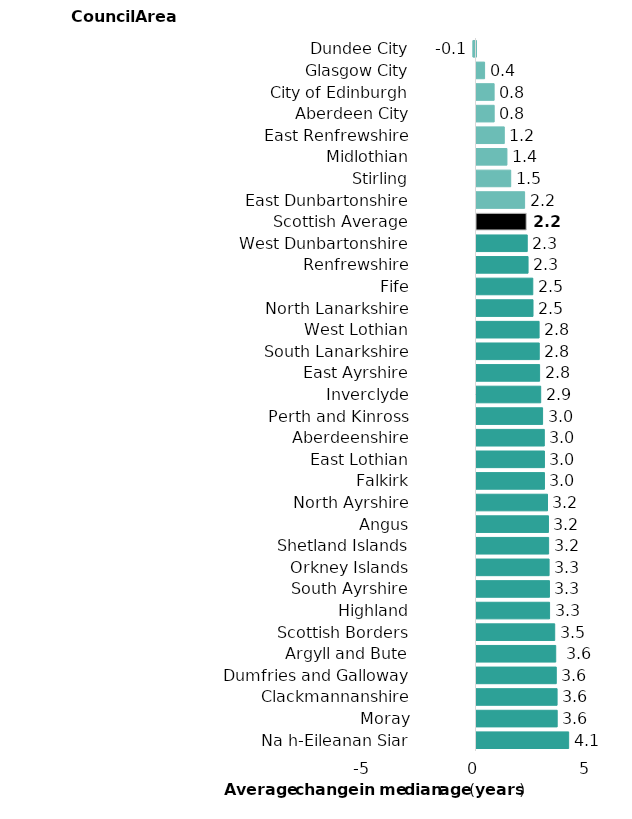
| Category | Series 0 |
|---|---|
| Na h-Eileanan Siar | 4.133 |
| Moray | 3.618 |
| Clackmannanshire | 3.614 |
| Dumfries and Galloway | 3.578 |
| Argyll and Bute | 3.553 |
| Scottish Borders | 3.507 |
| Highland | 3.277 |
| South Ayrshire | 3.271 |
| Orkney Islands | 3.256 |
| Shetland Islands | 3.235 |
| Angus | 3.226 |
| North Ayrshire | 3.184 |
| Falkirk | 3.047 |
| East Lothian | 3.046 |
| Aberdeenshire | 3.041 |
| Perth and Kinross | 2.963 |
| Inverclyde | 2.879 |
| East Ayrshire | 2.83 |
| South Lanarkshire | 2.814 |
| West Lothian | 2.807 |
| North Lanarkshire | 2.534 |
| Fife | 2.524 |
| Renfrewshire | 2.312 |
| West Dunbartonshire | 2.275 |
| Scottish Average | 2.228 |
| East Dunbartonshire | 2.157 |
| Stirling | 1.534 |
| Midlothian | 1.365 |
| East Renfrewshire | 1.246 |
| Aberdeen City | 0.793 |
| City of Edinburgh | 0.79 |
| Glasgow City | 0.363 |
| Dundee City | -0.133 |